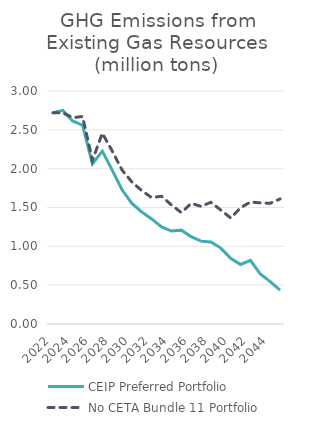
| Category | CEIP Preferred Portfolio | No CETA Bundle 11 Portfolio |
|---|---|---|
| 2022.0 | 2.719 | 2.719 |
| 2023.0 | 2.75 | 2.719 |
| 2024.0 | 2.614 | 2.657 |
| 2025.0 | 2.559 | 2.671 |
| 2026.0 | 2.061 | 2.106 |
| 2027.0 | 2.225 | 2.457 |
| 2028.0 | 1.981 | 2.228 |
| 2029.0 | 1.728 | 1.982 |
| 2030.0 | 1.553 | 1.829 |
| 2031.0 | 1.443 | 1.716 |
| 2032.0 | 1.353 | 1.627 |
| 2033.0 | 1.251 | 1.645 |
| 2034.0 | 1.196 | 1.533 |
| 2035.0 | 1.208 | 1.434 |
| 2036.0 | 1.124 | 1.553 |
| 2037.0 | 1.067 | 1.515 |
| 2038.0 | 1.056 | 1.567 |
| 2039.0 | 0.977 | 1.467 |
| 2040.0 | 0.847 | 1.365 |
| 2041.0 | 0.766 | 1.497 |
| 2042.0 | 0.82 | 1.571 |
| 2043.0 | 0.644 | 1.559 |
| 2044.0 | 0.545 | 1.555 |
| 2045.0 | 0.437 | 1.61 |